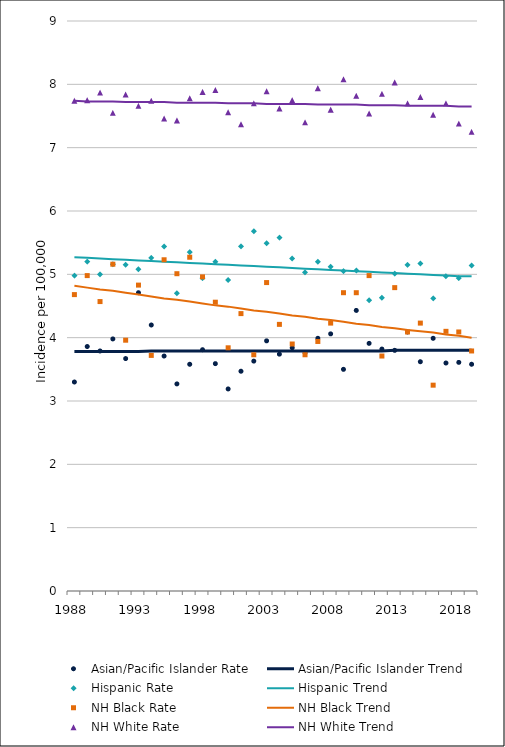
| Category | Asian/Pacific Islander Rate | Asian/Pacific Islander Trend | Hispanic Rate | Hispanic Trend | NH Black Rate | NH Black Trend | NH White Rate | NH White Trend |
|---|---|---|---|---|---|---|---|---|
| 1988.0 | 3.3 | 3.78 | 4.98 | 5.27 | 4.68 | 4.82 | 7.74 | 7.74 |
| 1989.0 | 3.86 | 3.78 | 5.2 | 5.26 | 4.98 | 4.79 | 7.75 | 7.73 |
| 1990.0 | 3.79 | 3.78 | 5 | 5.25 | 4.57 | 4.76 | 7.87 | 7.73 |
| 1991.0 | 3.98 | 3.78 | 5.16 | 5.24 | 5.16 | 4.74 | 7.55 | 7.73 |
| 1992.0 | 3.67 | 3.78 | 5.15 | 5.23 | 3.96 | 4.71 | 7.84 | 7.72 |
| 1993.0 | 4.71 | 3.78 | 5.08 | 5.22 | 4.83 | 4.68 | 7.66 | 7.72 |
| 1994.0 | 4.2 | 3.79 | 5.26 | 5.21 | 3.72 | 4.65 | 7.74 | 7.72 |
| 1995.0 | 3.71 | 3.79 | 5.44 | 5.2 | 5.23 | 4.62 | 7.46 | 7.72 |
| 1996.0 | 3.27 | 3.79 | 4.7 | 5.19 | 5.01 | 4.6 | 7.43 | 7.71 |
| 1997.0 | 3.58 | 3.79 | 5.35 | 5.18 | 5.27 | 4.57 | 7.78 | 7.71 |
| 1998.0 | 3.81 | 3.79 | 4.94 | 5.17 | 4.96 | 4.54 | 7.88 | 7.71 |
| 1999.0 | 3.59 | 3.79 | 5.2 | 5.16 | 4.56 | 4.51 | 7.91 | 7.71 |
| 2000.0 | 3.19 | 3.79 | 4.91 | 5.15 | 3.84 | 4.49 | 7.56 | 7.7 |
| 2001.0 | 3.47 | 3.79 | 5.44 | 5.14 | 4.38 | 4.46 | 7.37 | 7.7 |
| 2002.0 | 3.63 | 3.79 | 5.68 | 5.13 | 3.73 | 4.43 | 7.7 | 7.7 |
| 2003.0 | 3.95 | 3.79 | 5.49 | 5.12 | 4.87 | 4.41 | 7.89 | 7.69 |
| 2004.0 | 3.74 | 3.79 | 5.58 | 5.11 | 4.21 | 4.38 | 7.62 | 7.69 |
| 2005.0 | 3.84 | 3.79 | 5.25 | 5.1 | 3.9 | 4.35 | 7.75 | 7.69 |
| 2006.0 | 3.76 | 3.79 | 5.03 | 5.09 | 3.73 | 4.33 | 7.4 | 7.69 |
| 2007.0 | 3.99 | 3.79 | 5.2 | 5.08 | 3.94 | 4.3 | 7.94 | 7.68 |
| 2008.0 | 4.06 | 3.79 | 5.12 | 5.07 | 4.23 | 4.28 | 7.6 | 7.68 |
| 2009.0 | 3.5 | 3.79 | 5.05 | 5.06 | 4.71 | 4.25 | 8.08 | 7.68 |
| 2010.0 | 4.43 | 3.79 | 5.06 | 5.05 | 4.71 | 4.22 | 7.82 | 7.68 |
| 2011.0 | 3.91 | 3.79 | 4.59 | 5.04 | 4.98 | 4.2 | 7.54 | 7.67 |
| 2012.0 | 3.82 | 3.79 | 4.63 | 5.03 | 3.71 | 4.17 | 7.85 | 7.67 |
| 2013.0 | 3.8 | 3.8 | 5.01 | 5.02 | 4.79 | 4.15 | 8.03 | 7.67 |
| 2014.0 | 4.09 | 3.8 | 5.15 | 5.01 | 4.09 | 4.12 | 7.7 | 7.66 |
| 2015.0 | 3.62 | 3.8 | 5.17 | 5 | 4.23 | 4.1 | 7.8 | 7.66 |
| 2016.0 | 3.99 | 3.8 | 4.62 | 4.99 | 3.25 | 4.08 | 7.52 | 7.66 |
| 2017.0 | 3.6 | 3.8 | 4.97 | 4.98 | 4.1 | 4.05 | 7.7 | 7.66 |
| 2018.0 | 3.61 | 3.8 | 4.94 | 4.97 | 4.09 | 4.03 | 7.38 | 7.65 |
| 2019.0 | 3.58 | 3.8 | 5.14 | 4.97 | 3.79 | 4 | 7.25 | 7.65 |